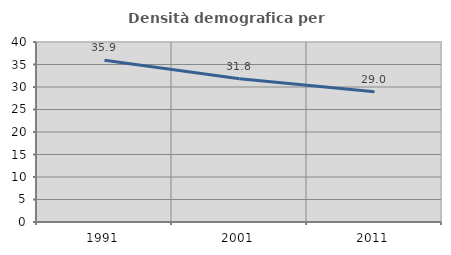
| Category | Densità demografica |
|---|---|
| 1991.0 | 35.939 |
| 2001.0 | 31.834 |
| 2011.0 | 28.95 |